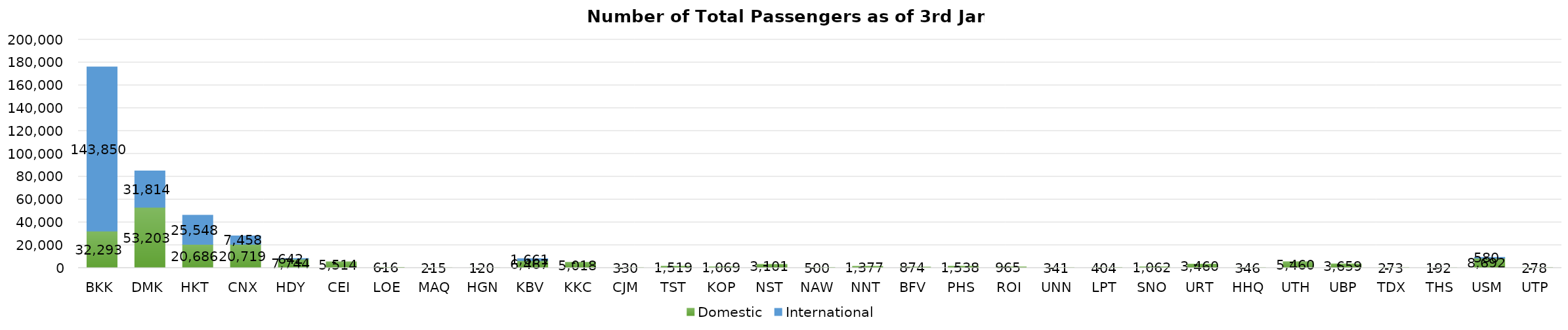
| Category | Domestic | International |
|---|---|---|
| BKK | 32293 | 143850 |
| DMK | 53203 | 31814 |
| HKT | 20686 | 25548 |
| CNX | 20719 | 7458 |
| HDY | 7744 | 642 |
| CEI | 5514 | 0 |
| LOE | 616 | 0 |
| MAQ | 215 | 0 |
| HGN | 120 | 0 |
| KBV | 6467 | 1661 |
| KKC | 5018 | 0 |
| CJM | 330 | 0 |
| TST | 1519 | 0 |
| KOP | 1069 | 0 |
| NST | 3101 | 0 |
| NAW | 500 | 0 |
| NNT | 1377 | 0 |
| BFV | 874 | 0 |
| PHS | 1538 | 0 |
| ROI | 965 | 0 |
| UNN | 341 | 0 |
| LPT | 404 | 0 |
| SNO | 1062 | 0 |
| URT | 3460 | 0 |
| HHQ | 346 | 0 |
| UTH | 5460 | 0 |
| UBP | 3659 | 0 |
| TDX | 273 | 0 |
| THS | 192 | 0 |
| USM | 8692 | 580 |
| UTP | 278 | 0 |